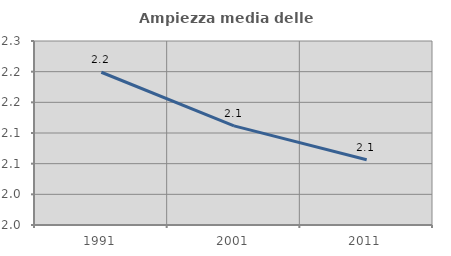
| Category | Ampiezza media delle famiglie |
|---|---|
| 1991.0 | 2.199 |
| 2001.0 | 2.112 |
| 2011.0 | 2.056 |